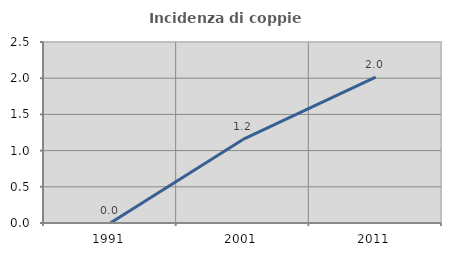
| Category | Incidenza di coppie miste |
|---|---|
| 1991.0 | 0 |
| 2001.0 | 1.155 |
| 2011.0 | 2.015 |